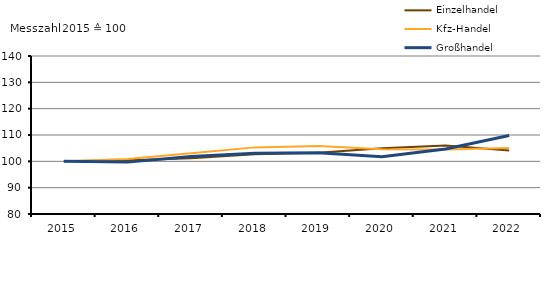
| Category | Einzelhandel | Kfz-Handel | Großhandel |
|---|---|---|---|
| 2015.0 | 100 | 100 | 100 |
| 2016.0 | 100.4 | 100.9 | 99.7 |
| 2017.0 | 101.2 | 103.1 | 101.8 |
| 2018.0 | 102.7 | 105.3 | 103.1 |
| 2019.0 | 103.3 | 105.8 | 103.3 |
| 2020.0 | 105 | 104.6 | 101.7 |
| 2021.0 | 106 | 104.5 | 104.7 |
| 2022.0 | 104.1 | 105.1 | 109.8 |